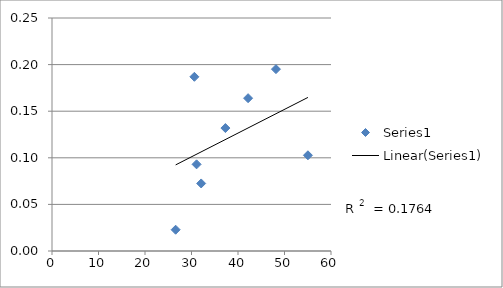
| Category | Series 0 |
|---|---|
| 37.288304841924344 | 0.132 |
| 31.092725658811275 | 0.093 |
| 42.1688577698831 | 0.164 |
| 48.15938306168594 | 0.195 |
| 32.08281674984786 | 0.072 |
| 55.03700745620046 | 0.103 |
| 30.619456563657874 | 0.187 |
| 26.589648385043382 | 0.023 |